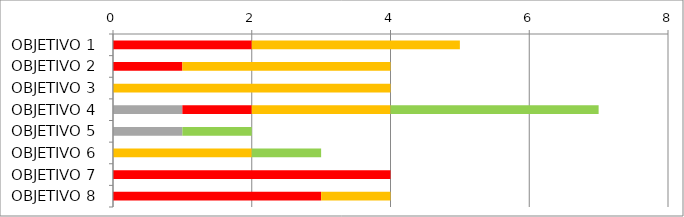
| Category | Series 0 | Series 1 | Series 2 | Series 3 | Series 4 |
|---|---|---|---|---|---|
| OBJETIVO 1 | 0 | 2 | 3 | 0 | 0 |
| OBJETIVO 2 | 0 | 1 | 3 | 0 | 0 |
| OBJETIVO 3 | 0 | 0 | 4 | 0 | 0 |
| OBJETIVO 4 | 1 | 1 | 2 | 3 | 0 |
| OBJETIVO 5 | 1 | 0 | 0 | 1 | 0 |
| OBJETIVO 6 | 0 | 0 | 2 | 1 | 0 |
| OBJETIVO 7 | 0 | 4 | 0 | 0 | 0 |
| OBJETIVO 8 | 0 | 3 | 1 | 0 | 0 |